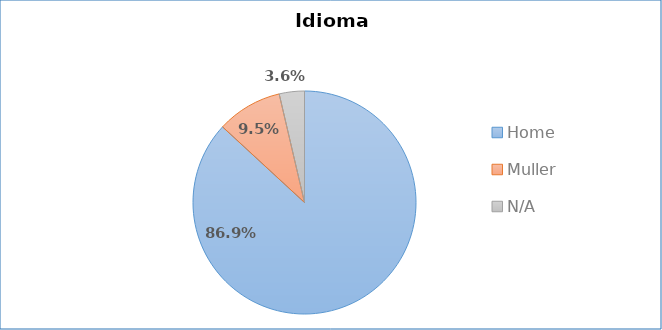
| Category | Idioma empregado |
|---|---|
| Home | 0.869 |
| Muller | 0.095 |
| N/A | 0.036 |